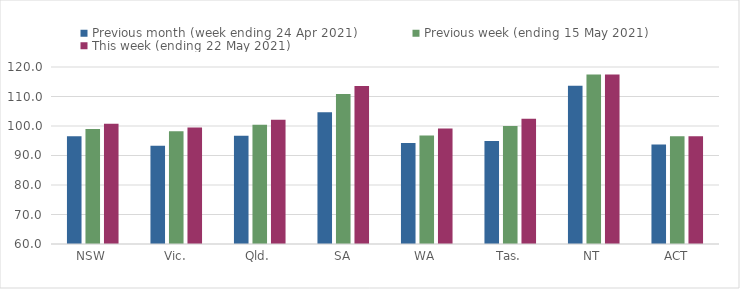
| Category | Previous month (week ending 24 Apr 2021) | Previous week (ending 15 May 2021) | This week (ending 22 May 2021) |
|---|---|---|---|
| NSW | 96.5 | 98.98 | 100.78 |
| Vic. | 93.31 | 98.24 | 99.48 |
| Qld. | 96.72 | 100.46 | 102.14 |
| SA | 104.68 | 110.88 | 113.6 |
| WA | 94.22 | 96.79 | 99.19 |
| Tas. | 94.93 | 99.99 | 102.47 |
| NT | 113.61 | 117.5 | 117.5 |
| ACT | 93.75 | 96.5 | 96.5 |